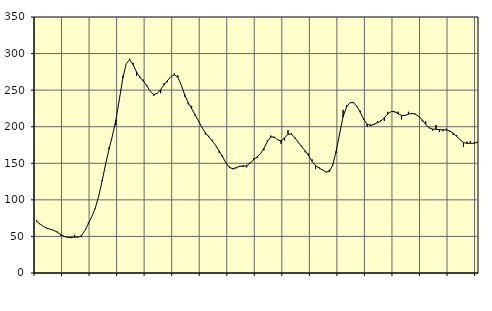
| Category | Piggar | Series 1 |
|---|---|---|
| nan | 72.2 | 70.2 |
| 87.0 | 66.4 | 66.82 |
| 87.0 | 63.4 | 63.47 |
| 87.0 | 60.5 | 61.09 |
| nan | 59.6 | 59.76 |
| 88.0 | 58 | 58.25 |
| 88.0 | 56.7 | 55.61 |
| 88.0 | 50.9 | 52.63 |
| nan | 49.6 | 49.89 |
| 89.0 | 49.3 | 48.65 |
| 89.0 | 47.6 | 48.89 |
| 89.0 | 52.2 | 49.01 |
| nan | 48.7 | 48.93 |
| 90.0 | 48.9 | 51.24 |
| 90.0 | 58 | 58.06 |
| 90.0 | 69.2 | 67.35 |
| nan | 76.8 | 76.92 |
| 91.0 | 87.7 | 88.49 |
| 91.0 | 105.3 | 104.83 |
| 91.0 | 127.1 | 125.73 |
| nan | 146.8 | 148.47 |
| 92.0 | 172 | 169.24 |
| 92.0 | 188.9 | 187.7 |
| 92.0 | 201.9 | 209.04 |
| nan | 236.8 | 237.04 |
| 93.0 | 269.5 | 266.18 |
| 93.0 | 286.3 | 286.27 |
| 93.0 | 293.3 | 291.33 |
| nan | 287.4 | 284.81 |
| 94.0 | 269.3 | 274.79 |
| 94.0 | 268.5 | 267.31 |
| 94.0 | 264.5 | 262.32 |
| nan | 257.2 | 255.71 |
| 95.0 | 247.8 | 248.13 |
| 95.0 | 242.1 | 243.94 |
| 95.0 | 245.7 | 245.47 |
| nan | 245.7 | 250.8 |
| 96.0 | 259.3 | 257.05 |
| 96.0 | 260.8 | 263.1 |
| 96.0 | 268.3 | 268.41 |
| nan | 273 | 271.07 |
| 97.0 | 270.1 | 267.63 |
| 97.0 | 256.9 | 256.92 |
| 97.0 | 241 | 243.66 |
| nan | 230.5 | 232.93 |
| 98.0 | 228.5 | 224.65 |
| 98.0 | 214.8 | 216.46 |
| 98.0 | 207.3 | 207.94 |
| nan | 199.4 | 199.22 |
| 99.0 | 189.2 | 191.87 |
| 99.0 | 187.6 | 185.97 |
| 99.0 | 182.2 | 180.61 |
| nan | 174 | 174.45 |
| 0.0 | 164.4 | 166.86 |
| 0.0 | 160.6 | 158.61 |
| 0.0 | 149.8 | 150.46 |
| nan | 145.3 | 144.3 |
| 1.0 | 141.7 | 142.51 |
| 1.0 | 143.1 | 144.13 |
| 1.0 | 146.6 | 145.79 |
| nan | 147.7 | 145.86 |
| 2.0 | 144.4 | 146.72 |
| 2.0 | 151 | 150.16 |
| 2.0 | 156.8 | 154.74 |
| nan | 157 | 158.65 |
| 3.0 | 163.5 | 162.96 |
| 3.0 | 167.7 | 170.47 |
| 3.0 | 181.1 | 179.65 |
| nan | 187.9 | 185.88 |
| 4.0 | 184.4 | 186 |
| 4.0 | 182.7 | 182.1 |
| 4.0 | 176.6 | 180.67 |
| nan | 181.3 | 184.71 |
| 5.0 | 195.4 | 189.71 |
| 5.0 | 191.3 | 189.88 |
| 5.0 | 184.1 | 185.09 |
| nan | 177.6 | 178.53 |
| 6.0 | 174 | 172.55 |
| 6.0 | 165 | 167.14 |
| 6.0 | 163.6 | 160.45 |
| nan | 155.4 | 152.64 |
| 7.0 | 142 | 146.74 |
| 7.0 | 145 | 143.57 |
| 7.0 | 141.4 | 141.03 |
| nan | 137.8 | 138.16 |
| 8.0 | 141.2 | 138.61 |
| 8.0 | 146.5 | 147.64 |
| 8.0 | 164.2 | 166.57 |
| nan | 191.5 | 190.65 |
| 9.0 | 223.1 | 213.2 |
| 9.0 | 229.6 | 226.84 |
| 9.0 | 232.9 | 232.85 |
| nan | 233.9 | 232.91 |
| 10.0 | 227.5 | 228.07 |
| 10.0 | 221.8 | 219.6 |
| 10.0 | 209.4 | 210.19 |
| nan | 199.7 | 203.49 |
| 11.0 | 203.2 | 201.55 |
| 11.0 | 202.4 | 203.4 |
| 11.0 | 207.6 | 205.46 |
| nan | 208.8 | 207.88 |
| 12.0 | 207.8 | 212.4 |
| 12.0 | 220.3 | 217.37 |
| 12.0 | 220.8 | 220.78 |
| nan | 219.6 | 220.61 |
| 13.0 | 220.6 | 217.73 |
| 13.0 | 210 | 215.42 |
| 13.0 | 216.1 | 215.37 |
| nan | 220.4 | 217.17 |
| 14.0 | 217.4 | 218.28 |
| 14.0 | 217.9 | 217.07 |
| 14.0 | 213.5 | 214.22 |
| nan | 207.3 | 209.43 |
| 15.0 | 207.3 | 203.39 |
| 15.0 | 198 | 198.61 |
| 15.0 | 194.7 | 196.7 |
| nan | 202.4 | 196.49 |
| 16.0 | 192.7 | 196.04 |
| 16.0 | 193.9 | 195.72 |
| 16.0 | 197.3 | 195.59 |
| nan | 193.3 | 194.22 |
| 17.0 | 188.8 | 191.21 |
| 17.0 | 188.8 | 186.96 |
| 17.0 | 182.4 | 182.11 |
| nan | 172.8 | 178.4 |
| 18.0 | 179.5 | 177.24 |
| 18.0 | 180.2 | 177.34 |
| 18.0 | 176.7 | 177.42 |
| nan | 179.6 | 178.49 |